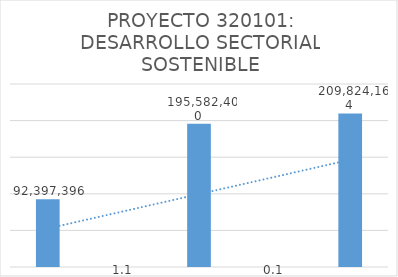
| Category | Series 0 |
|---|---|
| 0 | 92397396 |
| 1 | 1.117 |
| 2 | 195582400 |
| 3 | 0.073 |
| 4 | 209824164 |